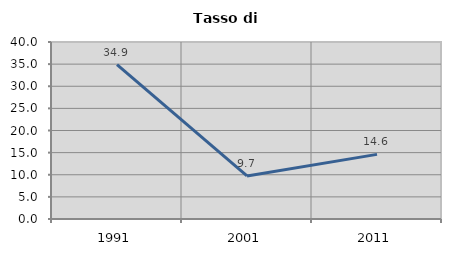
| Category | Tasso di disoccupazione   |
|---|---|
| 1991.0 | 34.874 |
| 2001.0 | 9.735 |
| 2011.0 | 14.607 |